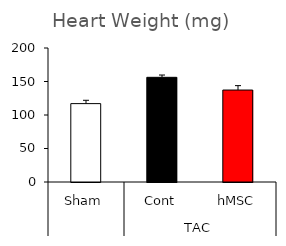
| Category | Series 1 |
|---|---|
| 0 | 117 |
| 1 | 156.25 |
| 2 | 137.25 |